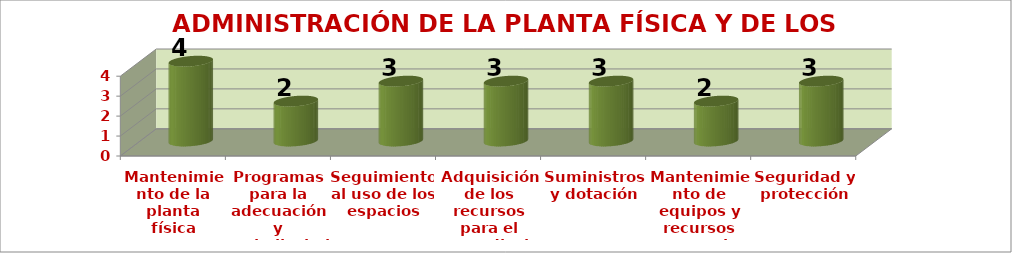
| Category | ADMINISTRACIÓN DE LA PLANTA FÍSICA Y DE LOS RECURSOS |
|---|---|
| Mantenimiento de la planta
física | 4 |
| Programas para la adecuación y
embellecimiento de la planta física | 2 |
| Seguimiento al uso de los
espacios | 3 |
| Adquisición de los recursos
para el aprendizaje | 3 |
| Suministros y dotación | 3 |
| Mantenimiento de equipos y recursos para el aprendizaje  | 2 |
| Seguridad y protección | 3 |